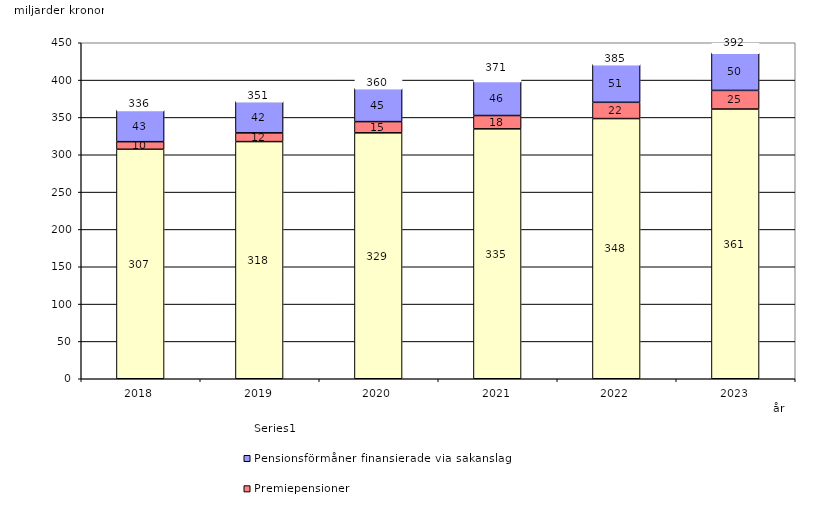
| Category | Inkomstpension och tilläggspension m.m. | Premiepensioner | Pensionsförmåner finansierade via sakanslag | Series 0 |
|---|---|---|---|---|
| 2018.0 | 307.356 | 10.141 | 42.55 | 20 |
| 2019.0 | 317.628 | 11.715 | 42.22 | 20 |
| 2020.0 | 329.365 | 15.016 | 44.546 | 20 |
| 2021.0 | 334.706 | 17.834 | 46.307 | 20 |
| 2022.0 | 348.454 | 21.789 | 50.893 | 20 |
| 2023.0 | 361.223 | 24.952 | 50.316 | 20 |